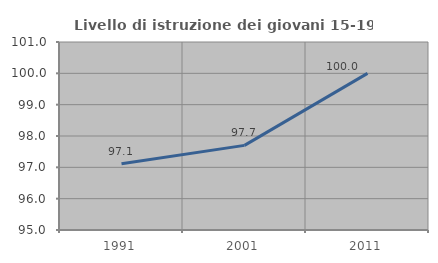
| Category | Livello di istruzione dei giovani 15-19 anni |
|---|---|
| 1991.0 | 97.115 |
| 2001.0 | 97.701 |
| 2011.0 | 100 |